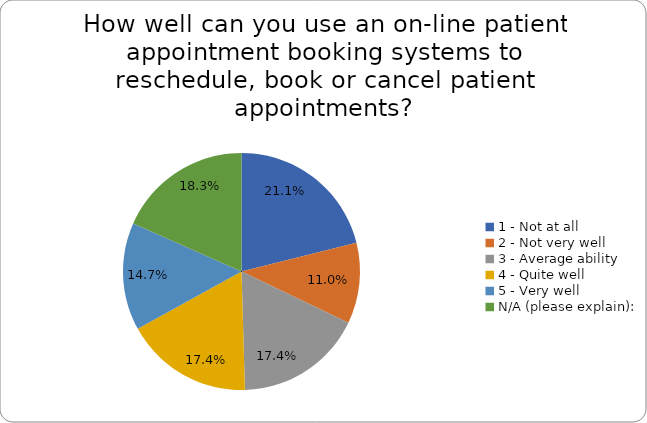
| Category | Series 0 |
|---|---|
| 1 - Not at all | 0.211 |
| 2 - Not very well | 0.11 |
| 3 - Average ability | 0.174 |
| 4 - Quite well | 0.174 |
| 5 - Very well | 0.147 |
| N/A (please explain): | 0.183 |